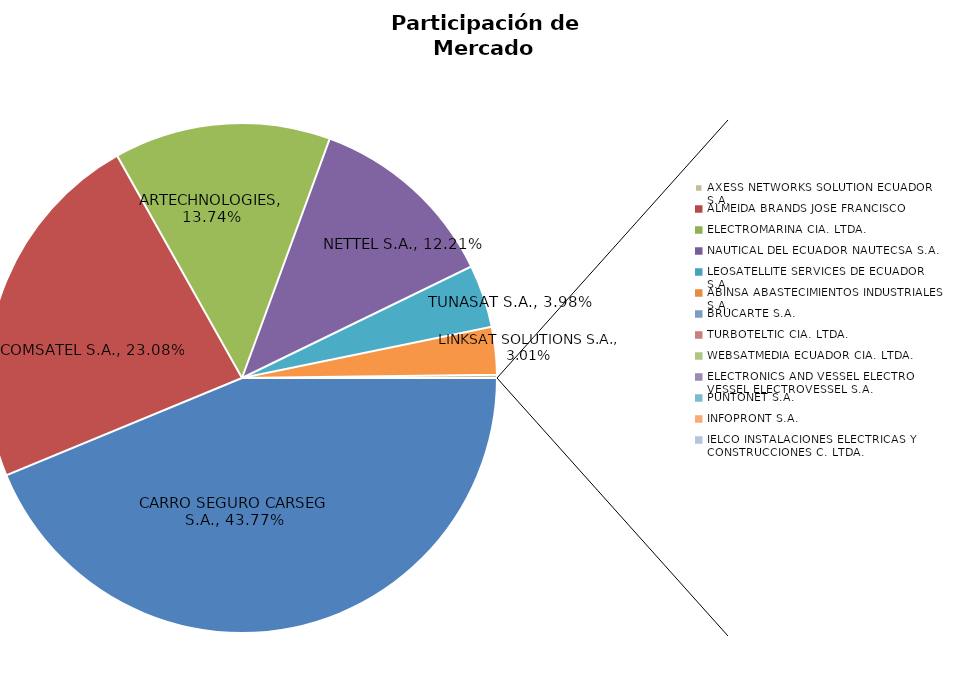
| Category | Series 0 |
|---|---|
| CARRO SEGURO CARSEG S.A. | 0.438 |
| COMSATEL S.A. | 0.231 |
| ARTECHNOLOGIES | 0.137 |
| NETTEL S.A. | 0.122 |
| TUNASAT S.A. | 0.04 |
| LINKSAT SOLUTIONS S.A. | 0.03 |
| AXESS NETWORKS SOLUTION ECUADOR S.A. | 0.002 |
| ALMEIDA BRANDS JOSE FRANCISCO | 0 |
| ELECTROMARINA CIA. LTDA. | 0 |
| NAUTICAL DEL ECUADOR NAUTECSA S.A. | 0 |
| LEOSATELLITE SERVICES DE ECUADOR S.A. | 0 |
| ABINSA ABASTECIMIENTOS INDUSTRIALES S.A. | 0 |
| BRUCARTE S.A. | 0 |
| TURBOTELTIC CIA. LTDA. | 0 |
| WEBSATMEDIA ECUADOR CIA. LTDA. | 0 |
| ELECTRONICS AND VESSEL ELECTRO VESSEL ELECTROVESSEL S.A. | 0 |
| PUNTONET S.A. | 0 |
| INFOPRONT S.A. | 0 |
| IELCO INSTALACIONES ELECTRICAS Y CONSTRUCCIONES C. LTDA. | 0 |